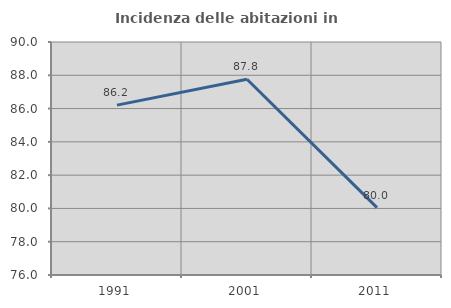
| Category | Incidenza delle abitazioni in proprietà  |
|---|---|
| 1991.0 | 86.207 |
| 2001.0 | 87.76 |
| 2011.0 | 80.05 |